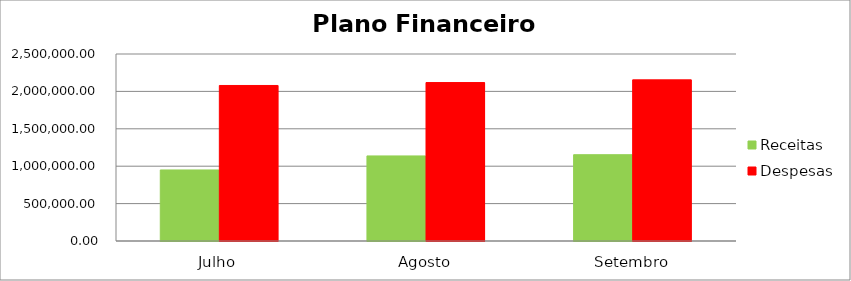
| Category | Receitas | Despesas |
|---|---|---|
| Julho | 949735.7 | 2079245.21 |
| Agosto | 1137239.72 | 2118339.42 |
| Setembro | 1153516.17 | 2154385.57 |